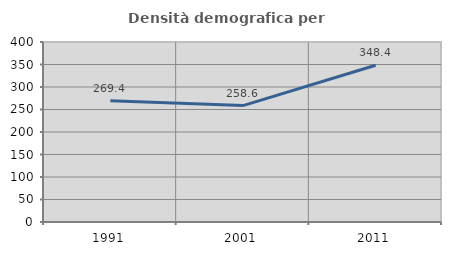
| Category | Densità demografica |
|---|---|
| 1991.0 | 269.442 |
| 2001.0 | 258.648 |
| 2011.0 | 348.404 |